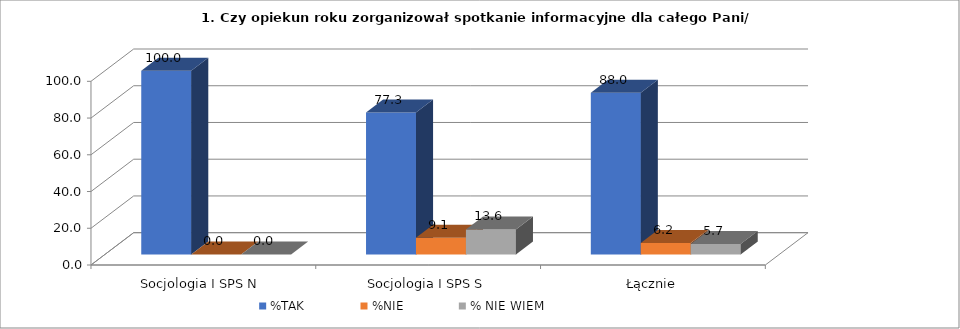
| Category | %TAK | %NIE | % NIE WIEM |
|---|---|---|---|
| Socjologia I SPS N  | 100 | 0 | 0 |
| Socjologia I SPS S | 77.273 | 9.091 | 13.636 |
| Łącznie | 88.038 | 6.22 | 5.742 |